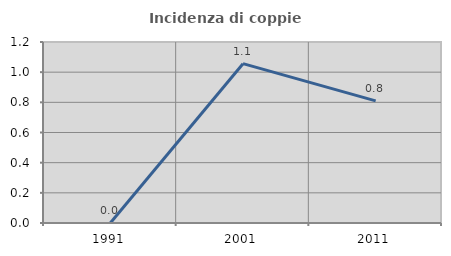
| Category | Incidenza di coppie miste |
|---|---|
| 1991.0 | 0 |
| 2001.0 | 1.056 |
| 2011.0 | 0.81 |